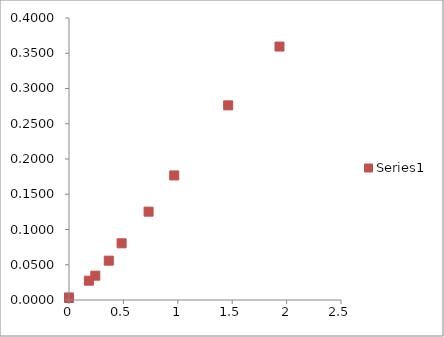
| Category | Series 1 |
|---|---|
| 0.0 | 0.003 |
| 0.0 | 0.004 |
| 0.182860048501917 | 0.027 |
| 0.241836794157068 | 0.034 |
| 0.365720097003833 | 0.056 |
| 0.483673588314135 | 0.08 |
| 0.731440194007666 | 0.125 |
| 0.96734717662827 | 0.177 |
| 1.462880388015333 | 0.276 |
| 1.934694353256541 | 0.36 |